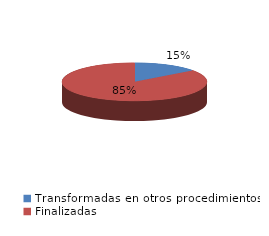
| Category | Series 0 |
|---|---|
| Transformadas en otros procedimientos | 3367 |
| Finalizadas | 19514 |